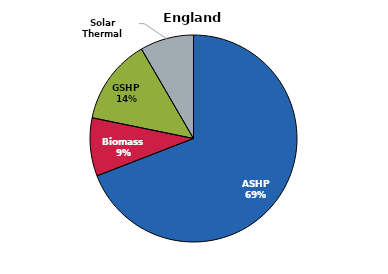
| Category | England |
|---|---|
| ASHP | 57152 |
| Biomass | 7516 |
| GSHP | 11079 |
| Solar Thermal | 6937 |